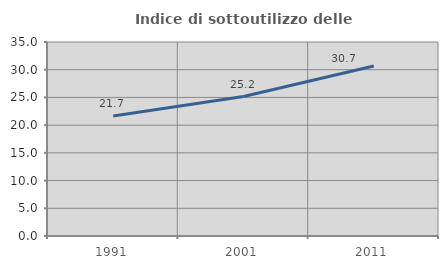
| Category | Indice di sottoutilizzo delle abitazioni  |
|---|---|
| 1991.0 | 21.655 |
| 2001.0 | 25.153 |
| 2011.0 | 30.684 |